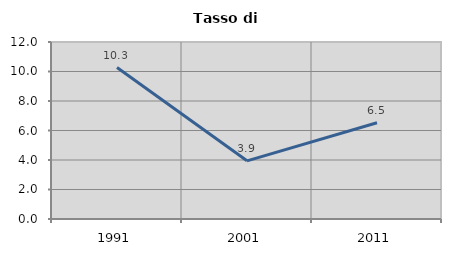
| Category | Tasso di disoccupazione   |
|---|---|
| 1991.0 | 10.27 |
| 2001.0 | 3.944 |
| 2011.0 | 6.526 |